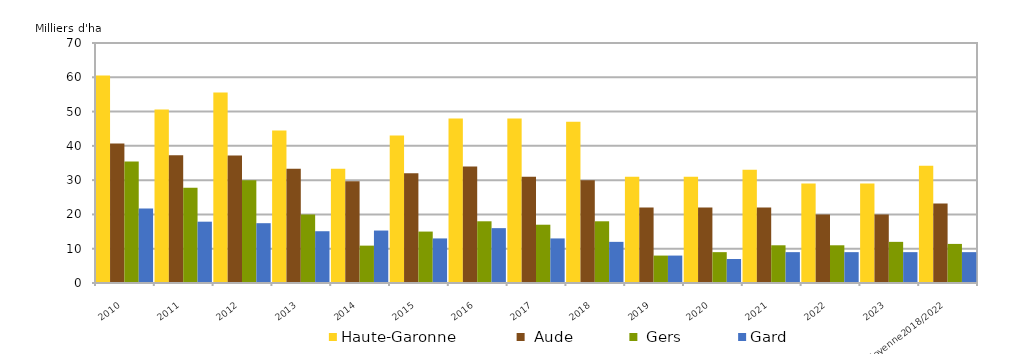
| Category | Haute-Garonne  |  Aude |  Gers | Gard |
|---|---|---|---|---|
| 2010 | 60.5 | 40.695 | 35.47 | 21.755 |
| 2011 | 50.631 | 37.28 | 27.813 | 17.885 |
| 2012 | 55.545 | 37.21 | 29.944 | 17.445 |
| 2013 | 44.496 | 33.3 | 19.977 | 15.1 |
| 2014 | 33.3 | 29.7 | 10.9 | 15.3 |
| 2015 | 43 | 32 | 15 | 13 |
| 2016 | 48 | 34 | 18 | 16 |
| 2017 | 48 | 31 | 17 | 13 |
| 2018 | 47 | 30 | 18 | 12 |
| 2019 | 31 | 22 | 8 | 8 |
| 2020 | 31 | 22 | 9 | 7 |
| 2021 | 33 | 22 | 11 | 9 |
| 2022 | 29 | 20 | 11 | 9 |
| 2023 | 29 | 20 | 12 | 9 |
| Moyenne2018/2022 | 34.2 | 23.2 | 11.4 | 9 |